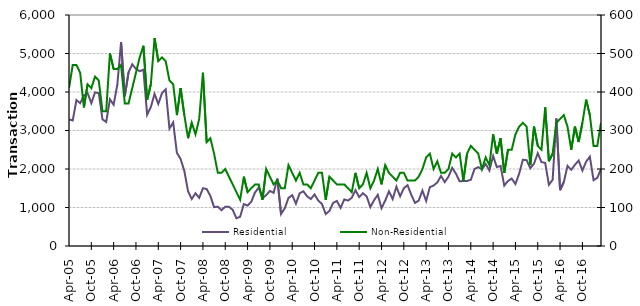
| Category | Residential |
|---|---|
| 2005-04-01 | 3290 |
| 2005-05-01 | 3260 |
| 2005-06-01 | 3790 |
| 2005-07-01 | 3710 |
| 2005-08-01 | 3910 |
| 2005-09-01 | 3970 |
| 2005-10-01 | 3710 |
| 2005-11-01 | 3990 |
| 2005-12-01 | 3970 |
| 2006-01-01 | 3290 |
| 2006-02-01 | 3220 |
| 2006-03-01 | 3810 |
| 2006-04-01 | 3670 |
| 2006-05-01 | 4200 |
| 2006-06-01 | 5300 |
| 2006-07-01 | 3890 |
| 2006-08-01 | 4510 |
| 2006-09-01 | 4720 |
| 2006-10-01 | 4600 |
| 2006-11-01 | 4540 |
| 2006-12-01 | 4580 |
| 2007-01-01 | 3410 |
| 2007-02-01 | 3610 |
| 2007-03-01 | 3950 |
| 2007-04-01 | 3690 |
| 2007-05-01 | 3970 |
| 2007-06-01 | 4070 |
| 2007-07-01 | 3050 |
| 2007-08-01 | 3210 |
| 2007-09-01 | 2420 |
| 2007-10-01 | 2260 |
| 2007-11-01 | 1950 |
| 2007-12-01 | 1420 |
| 2008-01-01 | 1220 |
| 2008-02-01 | 1370 |
| 2008-03-01 | 1250 |
| 2008-04-01 | 1500 |
| 2008-05-01 | 1480 |
| 2008-06-01 | 1300 |
| 2008-07-01 | 1010 |
| 2008-08-01 | 1020 |
| 2008-09-01 | 930 |
| 2008-10-01 | 1020 |
| 2008-11-01 | 1020 |
| 2008-12-01 | 940 |
| 2009-01-01 | 720 |
| 2009-02-01 | 760 |
| 2009-03-01 | 1090 |
| 2009-04-01 | 1050 |
| 2009-05-01 | 1150 |
| 2009-06-01 | 1390 |
| 2009-07-01 | 1520 |
| 2009-08-01 | 1240 |
| 2009-09-01 | 1320 |
| 2009-10-01 | 1430 |
| 2009-11-01 | 1380 |
| 2009-12-01 | 1750 |
| 2010-01-01 | 830 |
| 2010-02-01 | 980 |
| 2010-03-01 | 1250 |
| 2010-04-01 | 1320 |
| 2010-05-01 | 1100 |
| 2010-06-01 | 1370 |
| 2010-07-01 | 1420 |
| 2010-08-01 | 1290 |
| 2010-09-01 | 1220 |
| 2010-10-01 | 1340 |
| 2010-11-01 | 1180 |
| 2010-12-01 | 1090 |
| 2011-01-01 | 830 |
| 2011-02-01 | 910 |
| 2011-03-01 | 1120 |
| 2011-04-01 | 1170 |
| 2011-05-01 | 990 |
| 2011-06-01 | 1210 |
| 2011-07-01 | 1180 |
| 2011-08-01 | 1250 |
| 2011-09-01 | 1450 |
| 2011-10-01 | 1270 |
| 2011-11-01 | 1370 |
| 2011-12-01 | 1290 |
| 2012-01-01 | 1010 |
| 2012-02-01 | 1190 |
| 2012-03-01 | 1330 |
| 2012-04-01 | 980 |
| 2012-05-01 | 1180 |
| 2012-06-01 | 1420 |
| 2012-07-01 | 1220 |
| 2012-08-01 | 1540 |
| 2012-09-01 | 1290 |
| 2012-10-01 | 1500 |
| 2012-11-01 | 1580 |
| 2012-12-01 | 1330 |
| 2013-01-01 | 1120 |
| 2013-02-01 | 1180 |
| 2013-03-01 | 1440 |
| 2013-04-01 | 1170 |
| 2013-05-01 | 1530 |
| 2013-06-01 | 1570 |
| 2013-07-01 | 1650 |
| 2013-08-01 | 1820 |
| 2013-09-01 | 1660 |
| 2013-10-01 | 1800 |
| 2013-11-01 | 2030 |
| 2013-12-01 | 1880 |
| 2014-01-01 | 1680 |
| 2014-02-01 | 1690 |
| 2014-03-01 | 1690 |
| 2014-04-01 | 1720 |
| 2014-05-01 | 2000 |
| 2014-06-01 | 2050 |
| 2014-07-01 | 1990 |
| 2014-08-01 | 2130 |
| 2014-09-01 | 1960 |
| 2014-10-01 | 2340 |
| 2014-11-01 | 2050 |
| 2014-12-01 | 2080 |
| 2015-01-01 | 1570 |
| 2015-02-01 | 1690 |
| 2015-03-01 | 1750 |
| 2015-04-01 | 1610 |
| 2015-05-01 | 1880 |
| 2015-06-01 | 2240 |
| 2015-07-01 | 2230 |
| 2015-08-01 | 2020 |
| 2015-09-01 | 2140 |
| 2015-10-01 | 2410 |
| 2015-11-01 | 2180 |
| 2015-12-01 | 2160 |
| 2016-01-01 | 1590 |
| 2016-02-01 | 1720 |
| 2016-03-01 | 3310 |
| 2016-04-01 | 1450 |
| 2016-05-01 | 1660 |
| 2016-06-01 | 2080 |
| 2016-07-01 | 1980 |
| 2016-08-01 | 2110 |
| 2016-09-01 | 2220 |
| 2016-10-01 | 1960 |
| 2016-11-01 | 2190 |
| 2016-12-01 | 2320 |
| 2017-01-01 | 1710 |
| 2017-02-01 | 1770 |
| 2017-03-01 | 2000 |